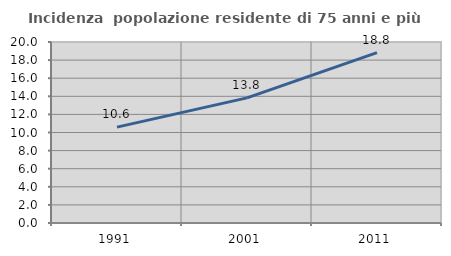
| Category | Incidenza  popolazione residente di 75 anni e più |
|---|---|
| 1991.0 | 10.591 |
| 2001.0 | 13.827 |
| 2011.0 | 18.817 |